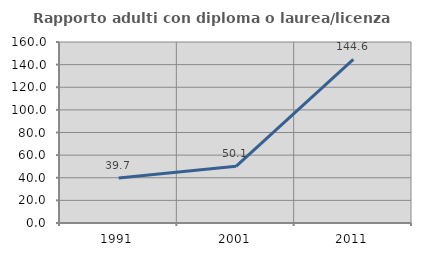
| Category | Rapporto adulti con diploma o laurea/licenza media  |
|---|---|
| 1991.0 | 39.692 |
| 2001.0 | 50.12 |
| 2011.0 | 144.65 |